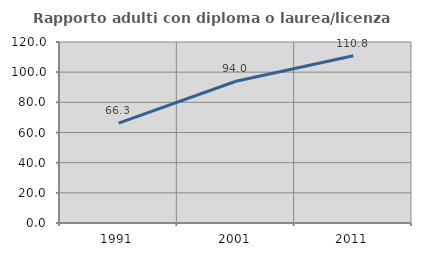
| Category | Rapporto adulti con diploma o laurea/licenza media  |
|---|---|
| 1991.0 | 66.25 |
| 2001.0 | 93.966 |
| 2011.0 | 110.833 |